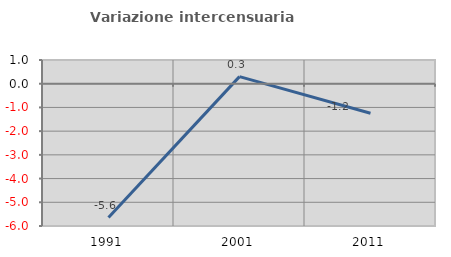
| Category | Variazione intercensuaria annua |
|---|---|
| 1991.0 | -5.645 |
| 2001.0 | 0.299 |
| 2011.0 | -1.244 |